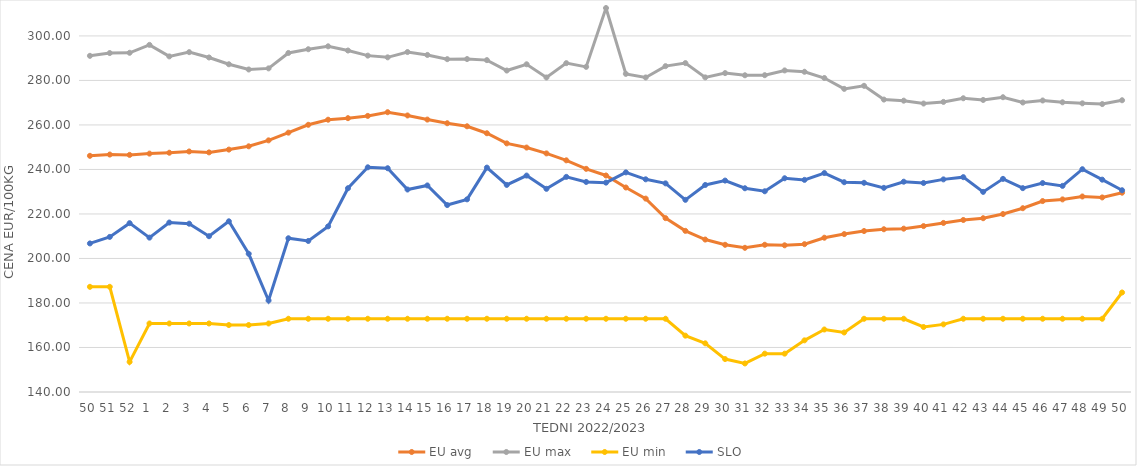
| Category | EU avg | EU max | EU min | SLO |
|---|---|---|---|---|
| 50.0 | 246.132 | 291.057 | 187.26 | 206.76 |
| 51.0 | 246.705 | 292.307 | 187.26 | 209.69 |
| 52.0 | 246.546 | 292.426 | 153.54 | 215.87 |
| 1.0 | 247.118 | 295.98 | 170.79 | 209.37 |
| 2.0 | 247.516 | 290.8 | 170.79 | 216.15 |
| 3.0 | 248.079 | 292.71 | 170.79 | 215.63 |
| 4.0 | 247.672 | 290.32 | 170.79 | 210 |
| 5.0 | 248.924 | 287.27 | 170.09 | 216.7 |
| 6.0 | 250.4 | 284.92 | 170.09 | 202.1 |
| 7.0 | 253.074 | 285.42 | 170.79 | 181.11 |
| 8.0 | 256.543 | 292.35 | 172.91 | 209.08 |
| 9.0 | 260.066 | 294.02 | 172.91 | 207.87 |
| 10.0 | 262.352 | 295.33 | 172.91 | 214.42 |
| 11.0 | 263.049 | 293.44 | 172.91 | 231.56 |
| 12.0 | 264.068 | 291.15 | 172.91 | 240.97 |
| 13.0 | 265.73 | 290.38 | 172.91 | 240.55 |
| 14.0 | 264.262 | 292.763 | 172.91 | 230.99 |
| 15.0 | 262.411 | 291.46 | 172.91 | 232.82 |
| 16.0 | 260.77 | 289.56 | 172.91 | 224 |
| 17.0 | 259.395 | 289.61 | 172.91 | 226.57 |
| 18.0 | 256.275 | 289.13 | 172.91 | 240.83 |
| 19.0 | 251.716 | 284.45 | 172.91 | 233.05 |
| 20.0 | 249.836 | 287.26 | 172.91 | 237.25 |
| 21.0 | 247.212 | 281.33 | 172.91 | 231.3 |
| 22.0 | 244.103 | 287.77 | 172.91 | 236.67 |
| 23.0 | 240.279 | 286.1 | 172.91 | 234.39 |
| 24.0 | 237.289 | 312.54 | 172.91 | 234.08 |
| 25.0 | 231.895 | 282.95 | 172.91 | 238.69 |
| 26.0 | 226.903 | 281.34 | 172.91 | 235.57 |
| 27.0 | 218.126 | 286.43 | 172.91 | 233.75 |
| 28.0 | 212.406 | 287.8 | 165.32 | 226.35 |
| 29.0 | 208.504 | 281.37 | 161.87 | 233.03 |
| 30.0 | 206.149 | 283.3 | 154.8 | 235 |
| 31.0 | 204.79 | 282.32 | 152.83 | 231.55 |
| 32.0 | 206.16 | 282.36 | 157.23 | 230.2 |
| 33.0 | 205.917 | 284.5 | 157.23 | 236.04 |
| 34.0 | 206.436 | 283.9 | 163.21 | 235.32 |
| 35.0 | 209.326 | 281.09 | 168.085 | 238.39 |
| 36.0 | 210.957 | 276.21 | 166.745 | 234.27 |
| 37.0 | 212.325 | 277.59 | 172.91 | 234 |
| 38.0 | 213.132 | 271.4 | 172.91 | 231.74 |
| 39.0 | 213.398 | 270.91 | 172.91 | 234.5 |
| 40.0 | 214.548 | 269.62 | 169.209 | 233.92 |
| 41.0 | 215.966 | 270.36 | 170.387 | 235.54 |
| 42.0 | 217.294 | 271.99 | 172.91 | 236.54 |
| 43.0 | 218.091 | 271.22 | 172.91 | 229.92 |
| 44.0 | 219.965 | 272.45 | 172.91 | 235.77 |
| 45.0 | 222.584 | 270.09 | 172.91 | 231.6 |
| 46.0 | 225.795 | 270.99 | 172.91 | 233.89 |
| 47.0 | 226.547 | 270.18 | 172.91 | 232.62 |
| 48.0 | 227.853 | 269.71 | 172.91 | 240.11 |
| 49.0 | 227.428 | 269.38 | 172.91 | 235.41 |
| 50.0 | 229.558 | 271.1 | 184.72 | 230.65 |